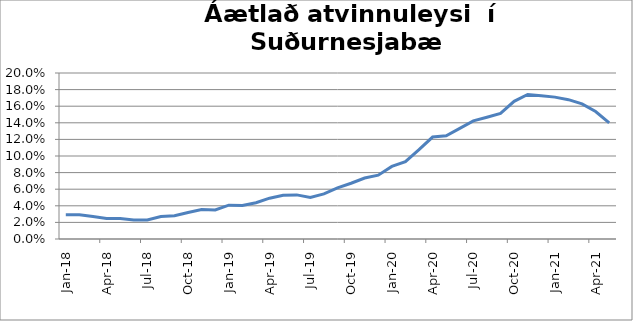
| Category | Series 0 |
|---|---|
| 2018-01-01 | 0.029 |
| 2018-02-01 | 0.029 |
| 2018-03-01 | 0.027 |
| 2018-04-01 | 0.025 |
| 2018-05-01 | 0.025 |
| 2018-06-01 | 0.023 |
| 2018-07-01 | 0.023 |
| 2018-08-01 | 0.027 |
| 2018-09-01 | 0.028 |
| 2018-10-01 | 0.032 |
| 2018-11-01 | 0.036 |
| 2018-12-01 | 0.035 |
| 2019-01-01 | 0.041 |
| 2019-02-01 | 0.04 |
| 2019-03-01 | 0.044 |
| 2019-04-01 | 0.049 |
| 2019-05-01 | 0.053 |
| 2019-06-01 | 0.053 |
| 2019-07-01 | 0.05 |
| 2019-08-01 | 0.054 |
| 2019-09-01 | 0.062 |
| 2019-10-01 | 0.067 |
| 2019-11-01 | 0.073 |
| 2019-12-01 | 0.077 |
| 2020-01-01 | 0.087 |
| 2020-02-01 | 0.093 |
| 2020-03-01 | 0.108 |
| 2020-04-01 | 0.123 |
| 2020-05-01 | 0.124 |
| 2020-06-01 | 0.133 |
| 2020-07-01 | 0.142 |
| 2020-08-01 | 0.147 |
| 2020-09-01 | 0.151 |
| 2020-10-01 | 0.166 |
| 2020-11-01 | 0.174 |
| 2020-12-01 | 0.173 |
| 2021-01-01 | 0.171 |
| 2021-02-01 | 0.168 |
| 2021-03-01 | 0.163 |
| 2021-04-01 | 0.154 |
| 2021-05-01 | 0.14 |